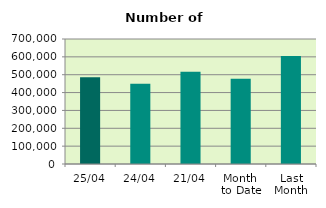
| Category | Series 0 |
|---|---|
| 25/04 | 485946 |
| 24/04 | 450074 |
| 21/04 | 516508 |
| Month 
to Date | 476916.4 |
| Last
Month | 605064 |